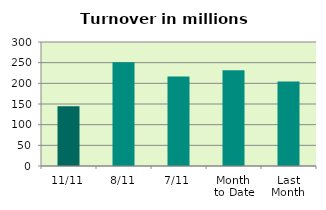
| Category | Series 0 |
|---|---|
| 11/11 | 144.342 |
| 8/11 | 250.734 |
| 7/11 | 216.38 |
| Month 
to Date | 231.807 |
| Last
Month | 204.729 |